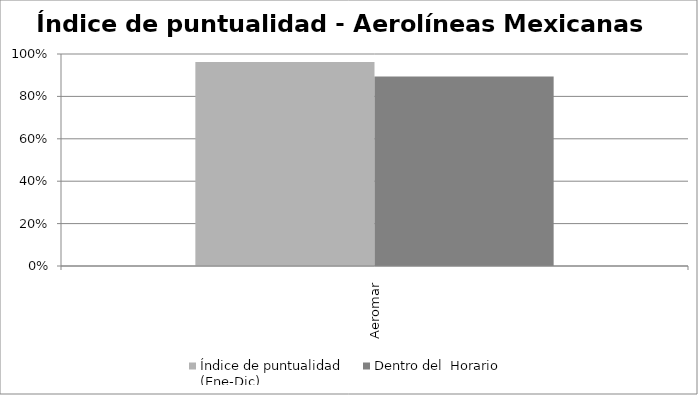
| Category | Índice de puntualidad
(Ene-Dic) | Dentro del  Horario |
|---|---|---|
| Aeromar | 0.962 | 0.894 |